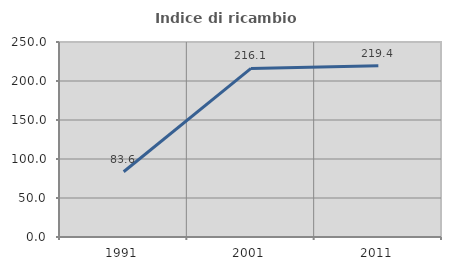
| Category | Indice di ricambio occupazionale  |
|---|---|
| 1991.0 | 83.607 |
| 2001.0 | 216.129 |
| 2011.0 | 219.444 |